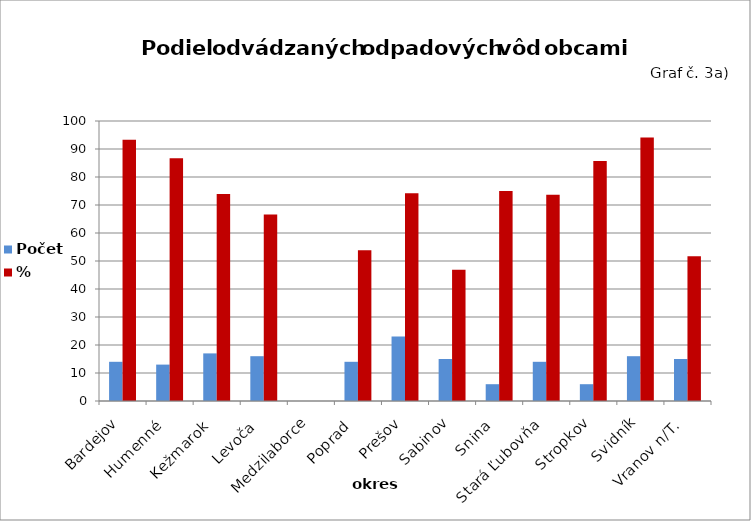
| Category | Počet  | %  |
|---|---|---|
| Bardejov | 14 | 93.3 |
| Humenné  | 13 | 86.7 |
| Kežmarok  | 17 | 73.9 |
| Levoča  | 16 | 66.6 |
| Medzilaborce | 0 | 0 |
| Poprad  | 14 | 53.8 |
| Prešov | 23 | 74.2 |
| Sabinov | 15 | 46.9 |
| Snina  | 6 | 75 |
| Stará Ľubovňa  | 14 | 73.7 |
| Stropkov | 6 | 85.7 |
| Svidník | 16 | 94.1 |
| Vranov n/T.  | 15 | 51.7 |